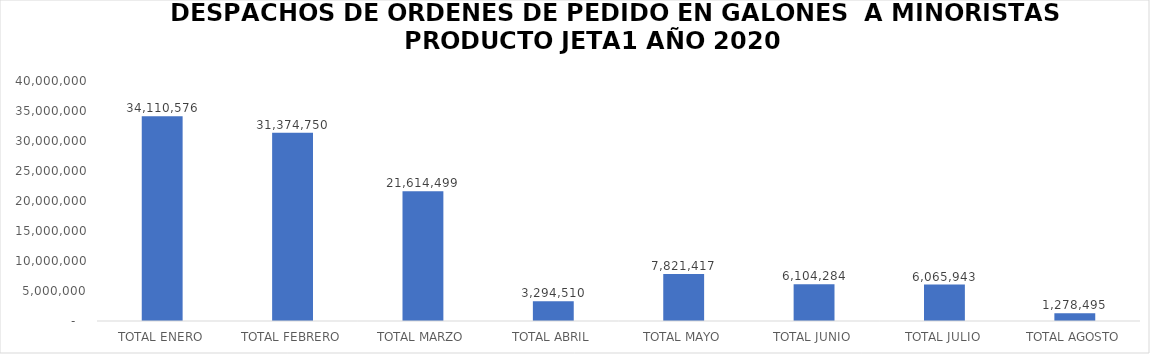
| Category | Series 0 |
|---|---|
| TOTAL ENERO | 34110575.81 |
| TOTAL FEBRERO | 31374750.17 |
| TOTAL MARZO | 21614498.94 |
| TOTAL ABRIL | 3294510.13 |
| TOTAL MAYO | 7821417.12 |
| TOTAL JUNIO | 6104283.81 |
| TOTAL JULIO | 6065942.68 |
| TOTAL AGOSTO | 1278495.16 |